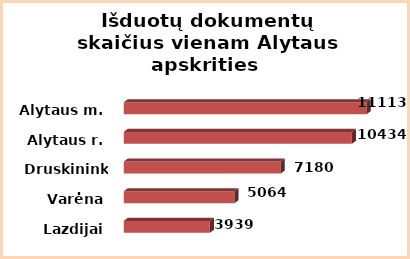
| Category | Series 0 |
|---|---|
| Lazdijai | 3939 |
| Varėna | 5064 |
| Druskininkai | 7180 |
| Alytaus r. | 10434 |
| Alytaus m. | 11113 |